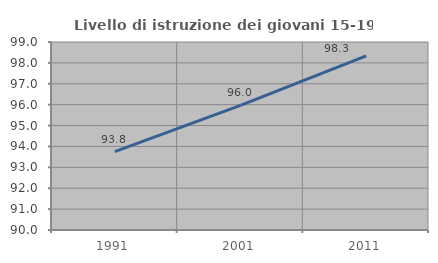
| Category | Livello di istruzione dei giovani 15-19 anni |
|---|---|
| 1991.0 | 93.75 |
| 2001.0 | 95.968 |
| 2011.0 | 98.333 |